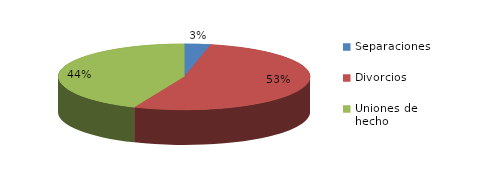
| Category | Series 0 |
|---|---|
| Separaciones | 50 |
| Divorcios | 786 |
| Uniones de hecho | 646 |